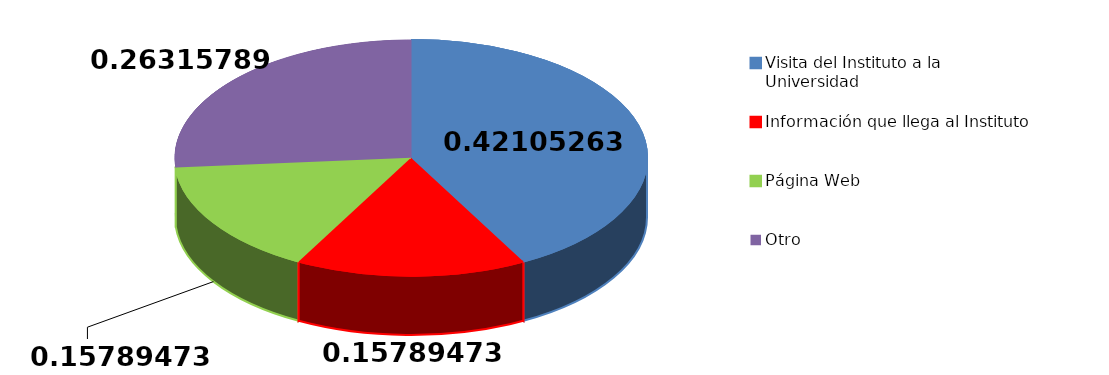
| Category | Frecuencia | Series 1 |
|---|---|---|
| Visita del Instituto a la Universidad | 8 |  |
| Información que llega al Instituto | 3 |  |
| Página Web | 3 |  |
| Otro | 5 |  |